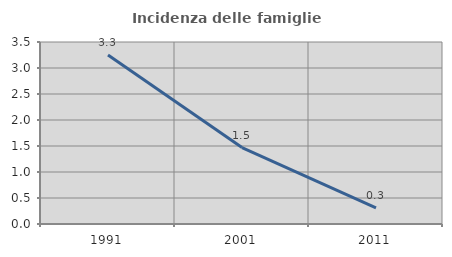
| Category | Incidenza delle famiglie numerose |
|---|---|
| 1991.0 | 3.252 |
| 2001.0 | 1.471 |
| 2011.0 | 0.308 |